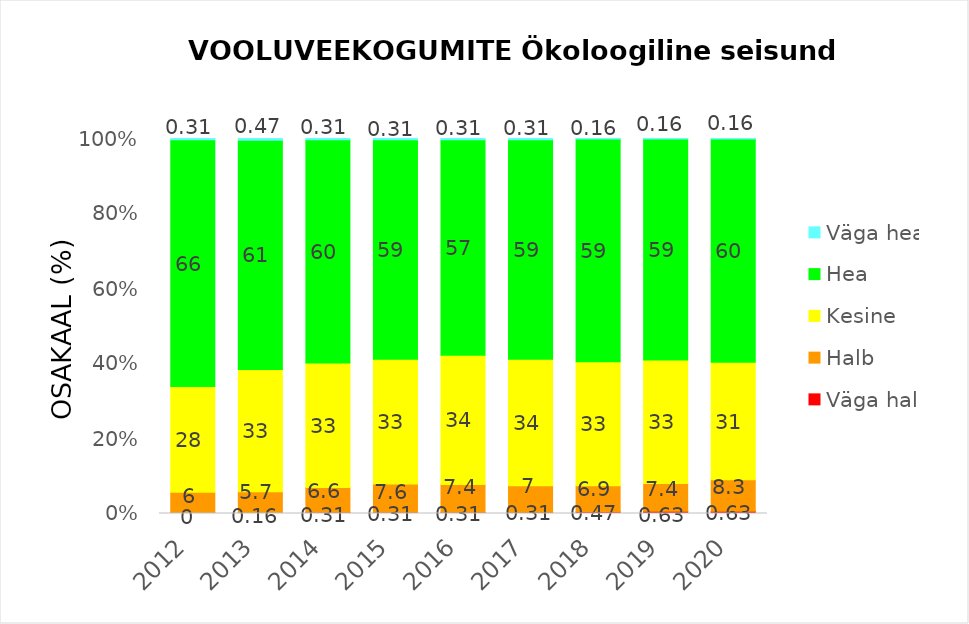
| Category | Väga halb | Halb | Kesine | Hea | Väga hea |
|---|---|---|---|---|---|
| 2012.0 | 0.157 | 5.512 | 28.189 | 65.827 | 0.315 |
| 2013.0 | 0.157 | 5.669 | 32.598 | 61.102 | 0.472 |
| 2014.0 | 0.315 | 6.614 | 33.228 | 59.528 | 0.315 |
| 2015.0 | 0.315 | 7.559 | 33.228 | 58.583 | 0.315 |
| 2016.0 | 0.315 | 7.402 | 34.488 | 57.48 | 0.315 |
| 2017.0 | 0.315 | 7.087 | 33.701 | 58.583 | 0.315 |
| 2018.0 | 0.472 | 6.929 | 33.071 | 59.37 | 0.157 |
| 2019.0 | 0.63 | 7.402 | 32.913 | 58.898 | 0.157 |
| 2020.0 | 0.63 | 8.346 | 31.339 | 59.528 | 0.157 |